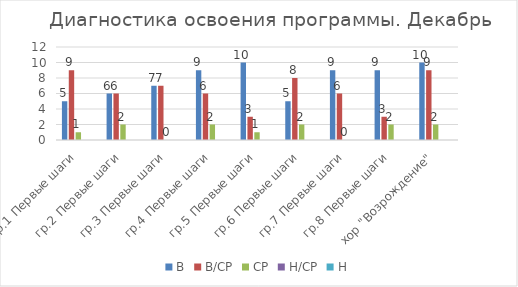
| Category | В | В/СР | СР | Н/СР | Н |
|---|---|---|---|---|---|
| гр.1 Первые шаги | 5 | 9 | 1 | 0 | 0 |
| гр.2 Первые шаги | 6 | 6 | 2 | 0 | 0 |
| гр.3 Первые шаги | 7 | 7 | 0 | 0 | 0 |
| гр.4 Первые шаги | 9 | 6 | 2 | 0 | 0 |
| гр.5 Первые шаги | 10 | 3 | 1 | 0 | 0 |
| гр.6 Первые шаги | 5 | 8 | 2 | 0 | 0 |
| гр.7 Первые шаги | 9 | 6 | 0 | 0 | 0 |
| гр.8 Первые шаги | 9 | 3 | 2 | 0 | 0 |
| хор "Возрождение" | 10 | 9 | 2 | 0 | 0 |